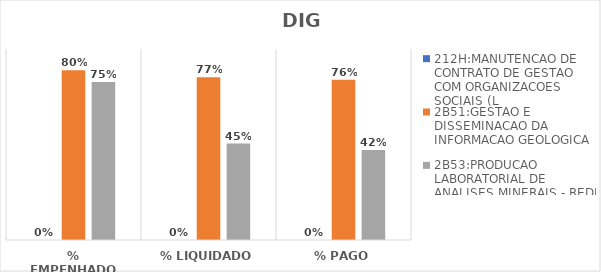
| Category | 212H:MANUTENCAO DE CONTRATO DE GESTAO COM ORGANIZACOES SOCIAIS (L | 2B51:GESTAO E DISSEMINACAO DA INFORMACAO GEOLOGICA | 2B53:PRODUCAO LABORATORIAL DE ANALISES MINERAIS - REDE LAMIN |
|---|---|---|---|
| % EMPENHADO | 0 | 0.8 | 0.745 |
| % LIQUIDADO | 0 | 0.766 | 0.455 |
| % PAGO | 0 | 0.756 | 0.424 |